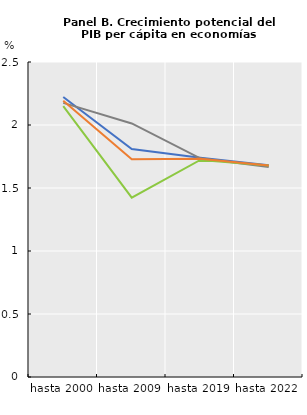
| Category | Simple average | HP | AR(1) | AR(2) |
|---|---|---|---|---|
| hasta 2000 | 2.222 | 2.175 | 2.149 | 2.193 |
| hasta 2009 | 1.81 | 2.012 | 1.423 | 1.727 |
| hasta 2019 | 1.74 | 1.736 | 1.723 | 1.732 |
| hasta 2022 | 1.68 | 1.667 | 1.68 | 1.678 |